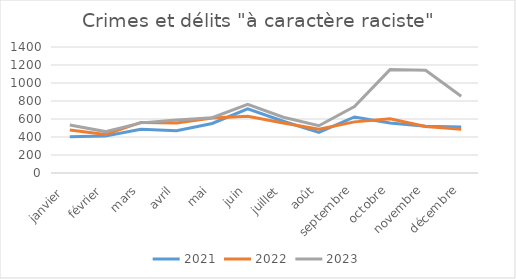
| Category | 2021 | 2022 | 2023 |
|---|---|---|---|
| janvier  | 402 | 477 | 533 |
| février | 411 | 427 | 460 |
| mars | 485 | 562 | 557 |
| avril | 470 | 556 | 590 |
| mai | 550 | 611 | 614 |
| juin | 713 | 630 | 763 |
| juillet | 575 | 555 | 620 |
| août | 451 | 487 | 525 |
| septembre | 623 | 568 | 738 |
| octobre | 555 | 603 | 1149 |
| novembre | 520 | 517 | 1141 |
| décembre | 512 | 485 | 852 |